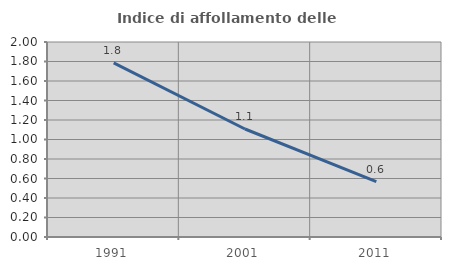
| Category | Indice di affollamento delle abitazioni  |
|---|---|
| 1991.0 | 1.786 |
| 2001.0 | 1.108 |
| 2011.0 | 0.568 |